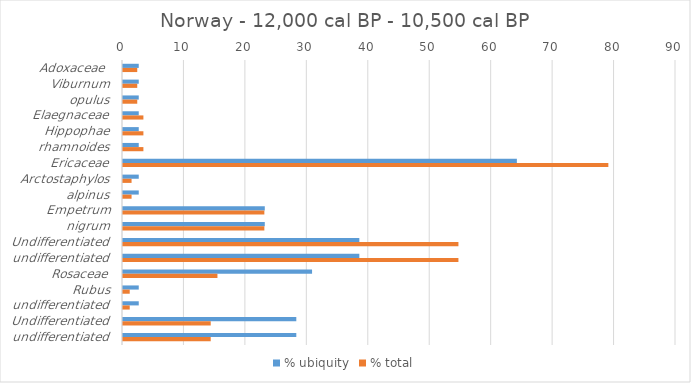
| Category | % ubiquity | % total |
|---|---|---|
| Adoxaceae  | 2.564 | 2.319 |
| Viburnum | 2.564 | 2.319 |
| opulus | 2.564 | 2.319 |
| Elaegnaceae | 2.564 | 3.32 |
| Hippophae | 2.564 | 3.32 |
| rhamnoides | 2.564 | 3.32 |
| Ericaceae | 64.103 | 78.99 |
| Arctostaphylos | 2.564 | 1.394 |
| alpinus | 2.564 | 1.394 |
| Empetrum | 23.077 | 23.005 |
| nigrum | 23.077 | 23.005 |
| Undifferentiated | 38.462 | 54.591 |
| undifferentiated | 38.462 | 54.591 |
| Rosaceae | 30.769 | 15.371 |
| Rubus | 2.564 | 1.095 |
| undifferentiated | 2.564 | 1.095 |
| Undifferentiated | 28.205 | 14.276 |
| undifferentiated | 28.205 | 14.276 |